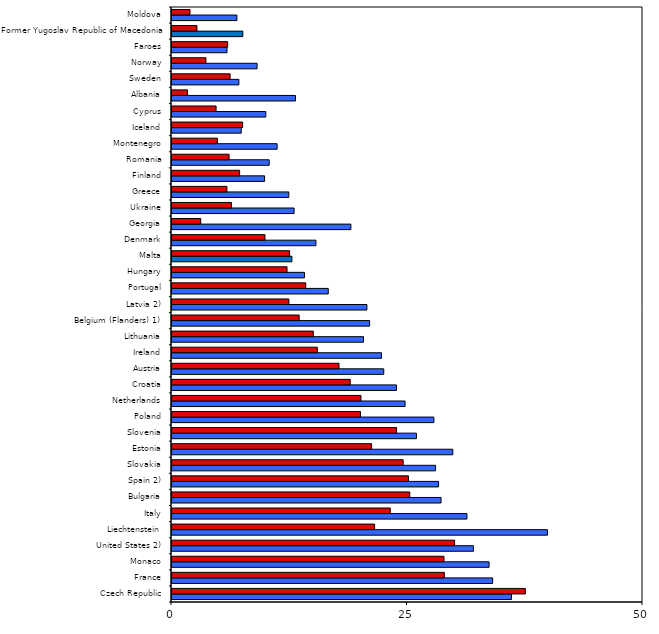
| Category | Boys | Girls |
|---|---|---|
| Czech Republic | 36.04 | 37.51 |
| France | 34.04 | 28.91 |
| Monaco | 33.66 | 28.87 |
| United States 2) | 32 | 30 |
| Liechtenstein | 39.86 | 21.51 |
| Italy | 31.31 | 23.17 |
| Bulgaria | 28.56 | 25.24 |
| Spain 2) | 28.3 | 25.1 |
| Slovakia | 27.98 | 24.54 |
| Estonia | 29.81 | 21.19 |
| Slovenia | 25.95 | 23.84 |
| Poland | 27.8 | 20.01 |
| Netherlands | 24.74 | 20.06 |
| Croatia | 23.83 | 18.92 |
| Austria | 22.48 | 17.73 |
| Ireland | 22.24 | 15.43 |
| Lithuania | 20.33 | 15 |
| Belgium (Flanders) 1) | 20.98 | 13.5 |
| Latvia 2) | 20.69 | 12.41 |
| Portugal | 16.59 | 14.2 |
| Hungary | 14.06 | 12.21 |
| Malta | 12.73 | 12.49 |
| Denmark | 15.28 | 9.87 |
| Georgia | 18.99 | 3.05 |
| Ukraine | 12.96 | 6.32 |
| Greece | 12.4 | 5.83 |
| Finland | 9.83 | 7.18 |
| Romania | 10.32 | 6.06 |
| Montenegro | 11.16 | 4.82 |
| Iceland | 7.35 | 7.5 |
| Cyprus | 9.96 | 4.68 |
| Albania | 13.11 | 1.65 |
| Sweden | 7.1 | 6.17 |
| Norway | 9.03 | 3.6 |
| Faroes | 5.84 | 5.91 |
| Former Yugoslav Republic of Macedonia | 7.52 | 2.65 |
| Moldova | 6.89 | 1.91 |